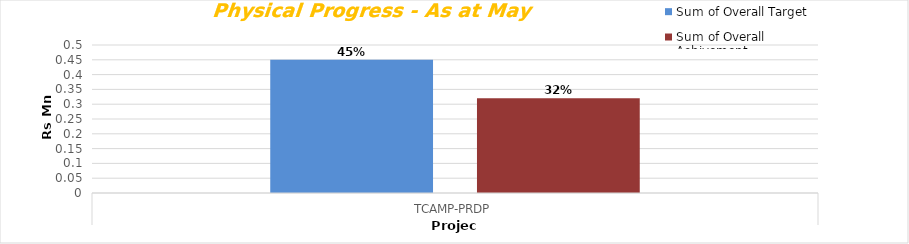
| Category | Sum of Overall Target | Sum of Overall Achivement |
|---|---|---|
| TCAMP-PRDP
 | 0.45 | 0.32 |